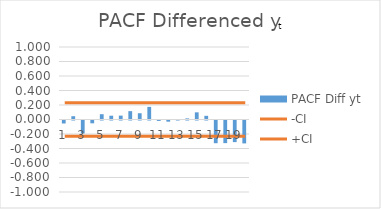
| Category | PACF Diff yt |
|---|---|
| 0 | -0.041 |
| 1 | 0.045 |
| 2 | -0.179 |
| 3 | -0.039 |
| 4 | 0.073 |
| 5 | 0.052 |
| 6 | 0.054 |
| 7 | 0.115 |
| 8 | 0.087 |
| 9 | 0.174 |
| 10 | -0.006 |
| 11 | -0.016 |
| 12 | 0.007 |
| 13 | 0.015 |
| 14 | 0.099 |
| 15 | 0.051 |
| 16 | -0.313 |
| 17 | -0.312 |
| 18 | -0.298 |
| 19 | -0.316 |